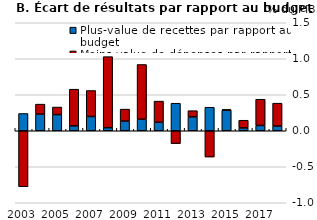
| Category | Plus-value de recettes par rapport au budget | Moins-value de dépenses par rapport au budget |
|---|---|---|
| 2003.0 | 0.24 | -0.777 |
| 2004.0 | 0.23 | 0.14 |
| 2005.0 | 0.225 | 0.105 |
| 2006.0 | 0.068 | 0.51 |
| 2007.0 | 0.198 | 0.361 |
| 2008.0 | 0.043 | 0.987 |
| 2009.0 | 0.134 | 0.166 |
| 2010.0 | 0.16 | 0.761 |
| 2011.0 | 0.118 | 0.293 |
| 2012.0 | 0.382 | -0.179 |
| 2013.0 | 0.193 | 0.087 |
| 2014.0 | 0.327 | -0.364 |
| 2015.0 | 0.286 | 0.008 |
| 2016.0 | 0.039 | 0.107 |
| 2017.0 | 0.073 | 0.364 |
| 2018.0 | 0.066 | 0.317 |